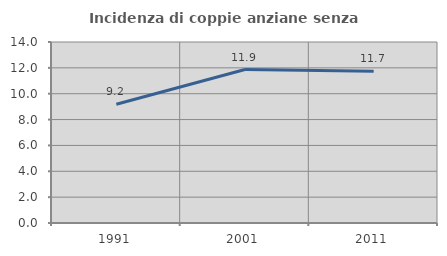
| Category | Incidenza di coppie anziane senza figli  |
|---|---|
| 1991.0 | 9.186 |
| 2001.0 | 11.869 |
| 2011.0 | 11.738 |